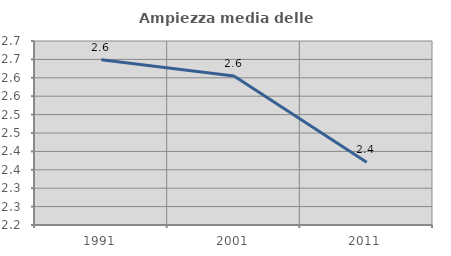
| Category | Ampiezza media delle famiglie |
|---|---|
| 1991.0 | 2.649 |
| 2001.0 | 2.605 |
| 2011.0 | 2.37 |